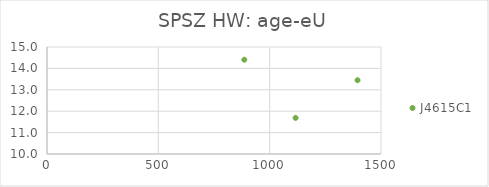
| Category | J4615C1 |
|---|---|
| 1116.3587694448913 | 11.687 |
| 1394.532098412607 | 13.447 |
| 886.0542571203741 | 14.405 |